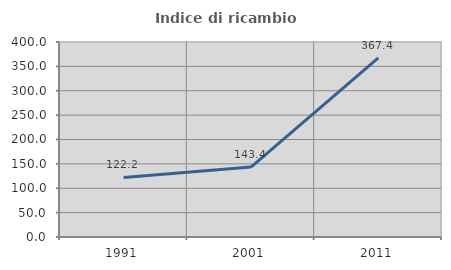
| Category | Indice di ricambio occupazionale  |
|---|---|
| 1991.0 | 122.222 |
| 2001.0 | 143.421 |
| 2011.0 | 367.442 |